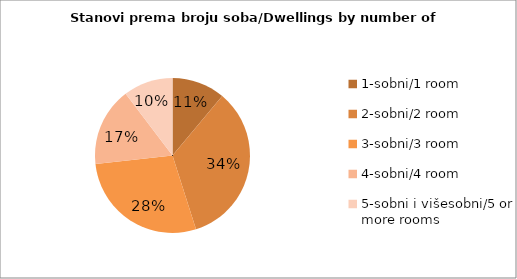
| Category | Series 0 |
|---|---|
| 1-sobni/1 room  | 104 |
| 2-sobni/2 room | 319 |
| 3-sobni/3 room | 264 |
| 4-sobni/4 room  | 154 |
| 5-sobni i višesobni/5 or more rooms  | 97 |